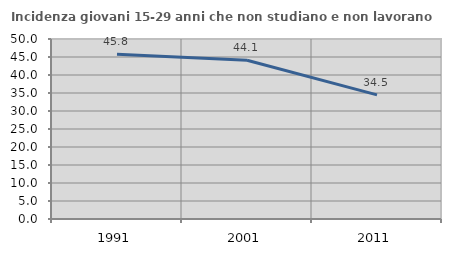
| Category | Incidenza giovani 15-29 anni che non studiano e non lavorano  |
|---|---|
| 1991.0 | 45.771 |
| 2001.0 | 44.111 |
| 2011.0 | 34.473 |